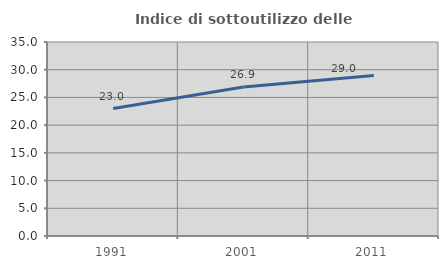
| Category | Indice di sottoutilizzo delle abitazioni  |
|---|---|
| 1991.0 | 22.991 |
| 2001.0 | 26.888 |
| 2011.0 | 28.965 |